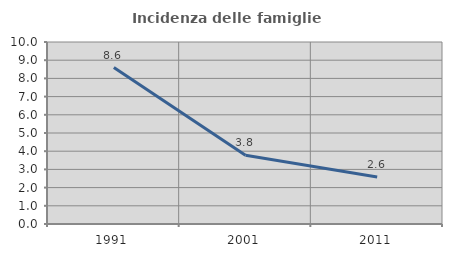
| Category | Incidenza delle famiglie numerose |
|---|---|
| 1991.0 | 8.597 |
| 2001.0 | 3.774 |
| 2011.0 | 2.581 |